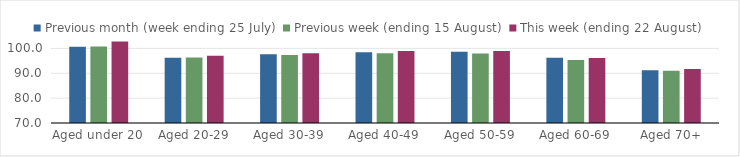
| Category | Previous month (week ending 25 July) | Previous week (ending 15 August) | This week (ending 22 August) |
|---|---|---|---|
| Aged under 20 | 100.645 | 100.823 | 102.738 |
| Aged 20-29 | 96.288 | 96.31 | 97.064 |
| Aged 30-39 | 97.703 | 97.335 | 98.105 |
| Aged 40-49 | 98.498 | 98.065 | 98.974 |
| Aged 50-59 | 98.615 | 97.979 | 98.951 |
| Aged 60-69 | 96.291 | 95.362 | 96.117 |
| Aged 70+ | 91.235 | 91.064 | 91.683 |